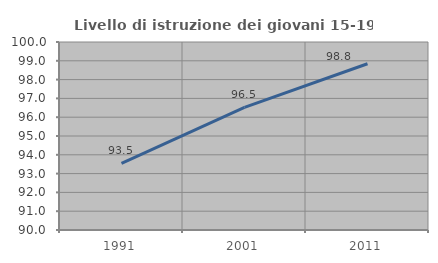
| Category | Livello di istruzione dei giovani 15-19 anni |
|---|---|
| 1991.0 | 93.543 |
| 2001.0 | 96.519 |
| 2011.0 | 98.844 |